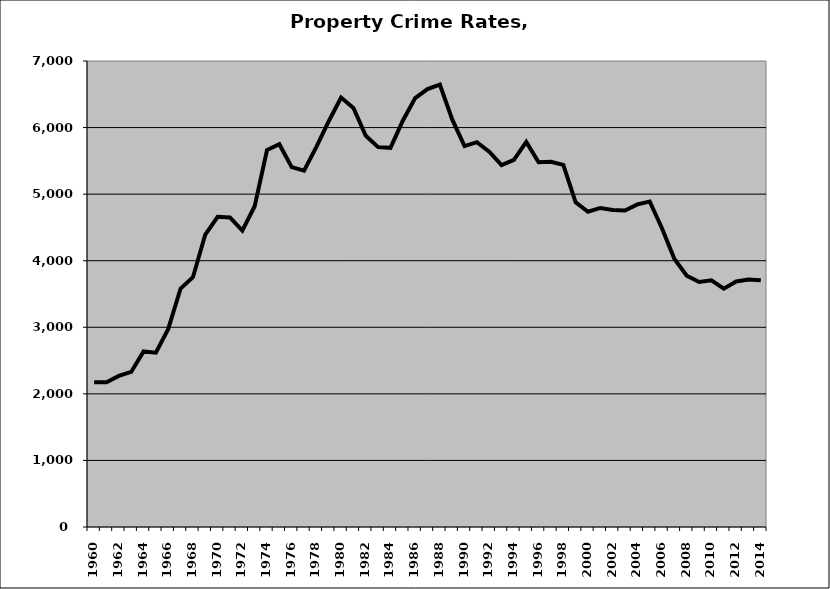
| Category | Property |
|---|---|
| 1960.0 | 2175.512 |
| 1961.0 | 2173.156 |
| 1962.0 | 2270.06 |
| 1963.0 | 2329.541 |
| 1964.0 | 2636.595 |
| 1965.0 | 2618.261 |
| 1966.0 | 2975.973 |
| 1967.0 | 3582.734 |
| 1968.0 | 3752.198 |
| 1969.0 | 4393.533 |
| 1970.0 | 4659.728 |
| 1971.0 | 4649.435 |
| 1972.0 | 4452.658 |
| 1973.0 | 4818.46 |
| 1974.0 | 5662.802 |
| 1975.0 | 5750.085 |
| 1976.0 | 5405.426 |
| 1977.0 | 5352.843 |
| 1978.0 | 5710.281 |
| 1979.0 | 6094.88 |
| 1980.0 | 6450.684 |
| 1981.0 | 6294.753 |
| 1982.0 | 5875.83 |
| 1983.0 | 5705.977 |
| 1984.0 | 5695.263 |
| 1985.0 | 6103.402 |
| 1986.0 | 6442.639 |
| 1987.0 | 6577.589 |
| 1988.0 | 6646.633 |
| 1989.0 | 6122.075 |
| 1990.0 | 5721.34 |
| 1991.0 | 5781.487 |
| 1992.0 | 5638.259 |
| 1993.0 | 5437.735 |
| 1994.0 | 5516.264 |
| 1995.0 | 5785.546 |
| 1996.0 | 5478.24 |
| 1997.0 | 5485.597 |
| 1998.0 | 5438.9 |
| 1999.0 | 4877.96 |
| 2000.0 | 4735.973 |
| 2001.0 | 4792.513 |
| 2002.0 | 4762.884 |
| 2003.0 | 4754.98 |
| 2004.0 | 4846.702 |
| 2005.0 | 4889.796 |
| 2006.0 | 4483.334 |
| 2007.0 | 4025.957 |
| 2008.0 | 3775.24 |
| 2009.0 | 3679.589 |
| 2010.0 | 3706.618 |
| 2011.0 | 3579.063 |
| 2012.0 | 3689.126 |
| 2013.0 | 3715.925 |
| 2014.0 | 3706.081 |